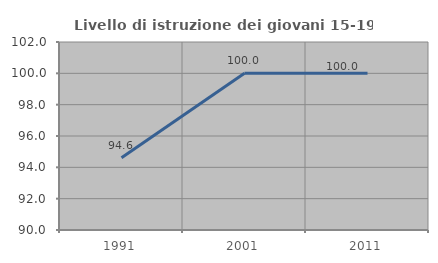
| Category | Livello di istruzione dei giovani 15-19 anni |
|---|---|
| 1991.0 | 94.615 |
| 2001.0 | 100 |
| 2011.0 | 100 |